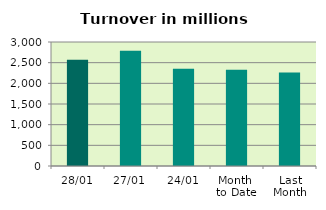
| Category | Series 0 |
|---|---|
| 28/01 | 2570.167 |
| 27/01 | 2790.042 |
| 24/01 | 2350.554 |
| Month 
to Date | 2330.688 |
| Last
Month | 2262.611 |